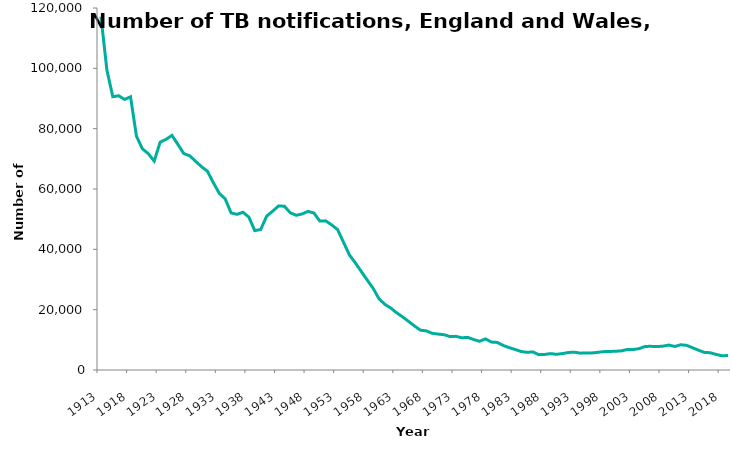
| Category | Series 0 |
|---|---|
| 1913.0 | 117139 |
| 1914.0 | 99497 |
| 1915.0 | 90592 |
| 1916.0 | 90908 |
| 1917.0 | 89685 |
| 1918.0 | 90573 |
| 1919.0 | 77511 |
| 1920.0 | 73332 |
| 1921.0 | 71702 |
| 1922.0 | 69259 |
| 1923.0 | 75501 |
| 1924.0 | 76448 |
| 1925.0 | 77773 |
| 1926.0 | 74820 |
| 1927.0 | 71745 |
| 1928.0 | 71024 |
| 1929.0 | 69178 |
| 1930.0 | 67401 |
| 1931.0 | 65882 |
| 1932.0 | 62078 |
| 1933.0 | 58577 |
| 1934.0 | 56728 |
| 1935.0 | 52070 |
| 1936.0 | 51604 |
| 1937.0 | 52291 |
| 1938.0 | 50689 |
| 1939.0 | 46205 |
| 1940.0 | 46572 |
| 1941.0 | 50964 |
| 1942.0 | 52619 |
| 1943.0 | 54342 |
| 1944.0 | 54313 |
| 1945.0 | 52109 |
| 1946.0 | 51289 |
| 1947.0 | 51725 |
| 1948.0 | 52576 |
| 1949.0 | 52041 |
| 1950.0 | 49358 |
| 1951.0 | 49439 |
| 1952.0 | 48093 |
| 1953.0 | 46546 |
| 1954.0 | 42348 |
| 1955.0 | 38134 |
| 1956.0 | 35504 |
| 1957.0 | 32669 |
| 1958.0 | 29838 |
| 1959.0 | 27100 |
| 1960.0 | 23605 |
| 1961.0 | 21747 |
| 1962.0 | 20519 |
| 1963.0 | 18937 |
| 1964.0 | 17599 |
| 1965.0 | 16103 |
| 1966.0 | 14601 |
| 1967.0 | 13206 |
| 1968.0 | 12954 |
| 1969.0 | 12165 |
| 1970.0 | 11901 |
| 1971.0 | 11697 |
| 1972.0 | 11073 |
| 1973.0 | 11156 |
| 1974.0 | 10677 |
| 1975.0 | 10818 |
| 1976.0 | 10098 |
| 1977.0 | 9520 |
| 1978.0 | 10312 |
| 1979.0 | 9266 |
| 1980.0 | 9142 |
| 1981.0 | 8128 |
| 1982.0 | 7410 |
| 1983.0 | 6803 |
| 1984.0 | 6141 |
| 1985.0 | 5857 |
| 1986.0 | 5993 |
| 1987.0 | 5086 |
| 1988.0 | 5164 |
| 1989.0 | 5432 |
| 1990.0 | 5204 |
| 1991.0 | 5436 |
| 1992.0 | 5799 |
| 1993.0 | 5921 |
| 1994.0 | 5591 |
| 1995.0 | 5608 |
| 1996.0 | 5654 |
| 1997.0 | 5859 |
| 1998.0 | 6087 |
| 1999.0 | 6144 |
| 2000.0 | 6225 |
| 2001.0 | 6349 |
| 2002.0 | 6821 |
| 2003.0 | 6784 |
| 2004.0 | 7098 |
| 2005.0 | 7819 |
| 2006.0 | 7841 |
| 2007.0 | 7754 |
| 2008.0 | 7918 |
| 2009.0 | 8270 |
| 2010.0 | 7796 |
| 2011.0 | 8373 |
| 2012.0 | 8171 |
| 2013.0 | 7368 |
| 2014.0 | 6572 |
| 2015.0 | 5842 |
| 2016.0 | 5716 |
| 2017.0 | 5162 |
| 2018.0 | 4705 |
| 2019.0 | 4812 |